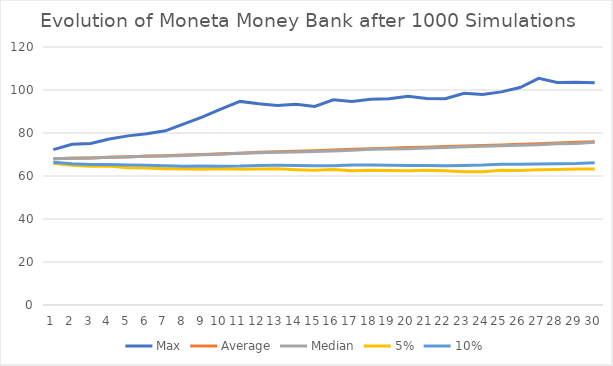
| Category | Max | Average | Median | 5% | 10% |
|---|---|---|---|---|---|
| 0 | 72.277 | 68.033 | 67.968 | 65.875 | 66.368 |
| 1 | 74.739 | 68.223 | 68.202 | 65.01 | 65.728 |
| 2 | 75.132 | 68.417 | 68.415 | 64.542 | 65.384 |
| 3 | 77.175 | 68.729 | 68.744 | 64.6 | 65.319 |
| 4 | 78.661 | 68.981 | 68.88 | 63.802 | 65.146 |
| 5 | 79.613 | 69.22 | 69.26 | 63.711 | 64.955 |
| 6 | 81.027 | 69.459 | 69.34 | 63.418 | 64.714 |
| 7 | 84.234 | 69.725 | 69.575 | 63.294 | 64.559 |
| 8 | 87.527 | 70.012 | 69.834 | 63.089 | 64.652 |
| 9 | 91.213 | 70.312 | 70.172 | 63.337 | 64.552 |
| 10 | 94.703 | 70.596 | 70.548 | 63.136 | 64.594 |
| 11 | 93.629 | 71.005 | 70.852 | 63.309 | 64.882 |
| 12 | 92.832 | 71.28 | 71.019 | 63.355 | 64.965 |
| 13 | 93.345 | 71.557 | 71.209 | 62.934 | 64.924 |
| 14 | 92.332 | 71.801 | 71.357 | 62.667 | 64.749 |
| 15 | 95.429 | 72.139 | 71.62 | 62.987 | 64.739 |
| 16 | 94.668 | 72.401 | 71.965 | 62.42 | 65.144 |
| 17 | 95.645 | 72.662 | 72.405 | 62.697 | 65.094 |
| 18 | 95.933 | 72.965 | 72.588 | 62.568 | 65.043 |
| 19 | 97.14 | 73.211 | 72.687 | 62.455 | 64.929 |
| 20 | 96.096 | 73.429 | 73.062 | 62.622 | 64.892 |
| 21 | 95.958 | 73.719 | 73.233 | 62.481 | 64.81 |
| 22 | 98.509 | 73.951 | 73.605 | 61.921 | 64.894 |
| 23 | 97.889 | 74.232 | 73.877 | 61.993 | 65.06 |
| 24 | 99.134 | 74.462 | 74.114 | 62.649 | 65.424 |
| 25 | 101.156 | 74.762 | 74.288 | 62.566 | 65.46 |
| 26 | 105.437 | 75.054 | 74.553 | 62.873 | 65.565 |
| 27 | 103.526 | 75.37 | 75.056 | 63.037 | 65.737 |
| 28 | 103.634 | 75.684 | 75.09 | 63.226 | 65.827 |
| 29 | 103.427 | 75.972 | 75.692 | 63.228 | 66.205 |